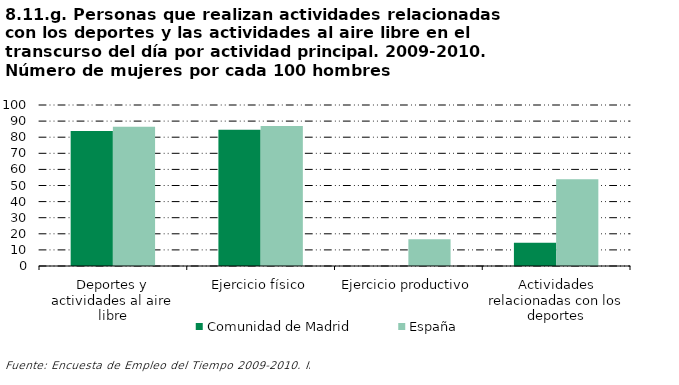
| Category | Comunidad de Madrid | España |
|---|---|---|
| Deportes y actividades al aire libre | 83.836 | 86.417 |
| Ejercicio físico | 84.679 | 86.967 |
| Ejercicio productivo | 0 | 16.667 |
| Actividades relacionadas con los deportes | 14.507 | 53.846 |